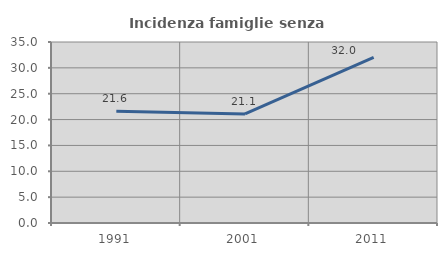
| Category | Incidenza famiglie senza nuclei |
|---|---|
| 1991.0 | 21.622 |
| 2001.0 | 21.097 |
| 2011.0 | 32.013 |